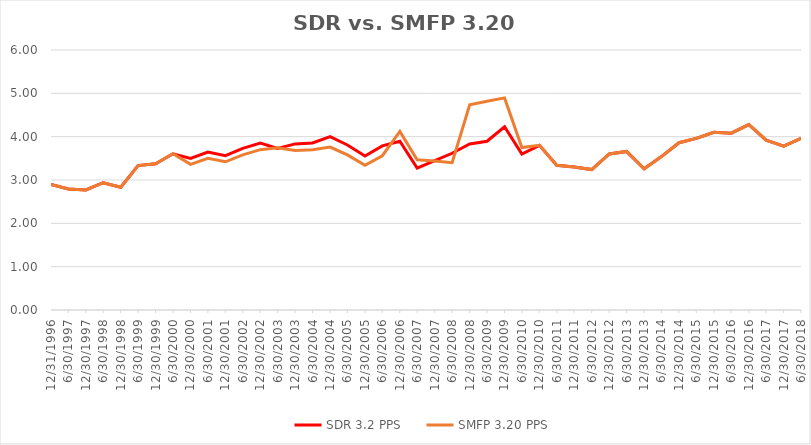
| Category | SDR 3.2 PPS | SMFP 3.20 PPS |
|---|---|---|
| 12/31/96 | 2.896 | 2.896 |
| 6/30/97 | 2.792 | 2.792 |
| 12/31/97 | 2.771 | 2.771 |
| 6/30/98 | 2.938 | 2.938 |
| 12/31/98 | 2.833 | 2.833 |
| 6/30/99 | 3.333 | 3.333 |
| 12/31/99 | 3.375 | 3.375 |
| 6/30/00 | 3.604 | 3.604 |
| 12/31/00 | 3.5 | 3.36 |
| 6/30/01 | 3.646 | 3.5 |
| 12/31/01 | 3.562 | 3.42 |
| 6/30/02 | 3.729 | 3.58 |
| 12/31/02 | 3.854 | 3.7 |
| 6/30/03 | 3.729 | 3.743 |
| 12/31/03 | 3.833 | 3.68 |
| 6/30/04 | 3.854 | 3.7 |
| 12/31/04 | 4 | 3.76 |
| 6/30/05 | 3.809 | 3.58 |
| 12/31/05 | 3.553 | 3.34 |
| 6/30/06 | 3.787 | 3.56 |
| 12/31/06 | 3.894 | 4.12 |
| 6/30/07 | 3.277 | 3.467 |
| 12/31/07 | 3.447 | 3.441 |
| 6/30/08 | 3.617 | 3.4 |
| 12/31/08 | 3.83 | 4.737 |
| 6/30/09 | 3.894 | 4.816 |
| 12/31/09 | 4.227 | 4.895 |
| 6/30/10 | 3.6 | 3.75 |
| 12/31/10 | 3.8 | 3.8 |
| 6/30/11 | 3.34 | 3.34 |
| 12/31/11 | 3.3 | 3.3 |
| 6/30/12 | 3.24 | 3.24 |
| 12/31/12 | 3.6 | 3.6 |
| 6/30/13 | 3.66 | 3.66 |
| 12/31/13 | 3.26 | 3.26 |
| 6/30/14 | 3.54 | 3.54 |
| 12/31/14 | 3.86 | 3.86 |
| 6/30/15 | 3.96 | 3.96 |
| 12/31/15 | 4.1 | 4.1 |
| 6/30/16 | 4.08 | 4.08 |
| 12/31/16 | 4.28 | 4.28 |
| 6/30/17 | 3.92 | 3.92 |
| 12/31/17 | 3.78 | 3.78 |
| 6/30/18 | 3.96 | 3.96 |